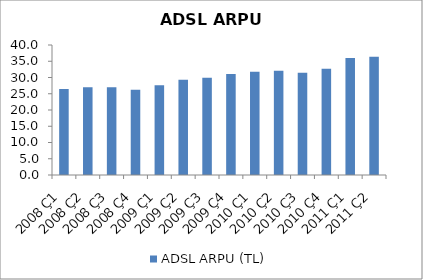
| Category | ADSL ARPU (TL) |
|---|---|
| 2008 Ç1 | 26.5 |
| 2008 Ç2 | 27 |
| 2008 Ç3 | 27 |
| 2008 Ç4 | 26.2 |
| 2009 Ç1 | 27.6 |
| 2009 Ç2 | 29.3 |
| 2009 Ç3 | 29.9 |
| 2009 Ç4 | 31.1 |
| 2010 Ç1 | 31.8 |
| 2010 Ç2 | 32.1 |
| 2010 Ç3 | 31.5 |
| 2010 Ç4 | 32.7 |
| 2011 Ç1 | 36 |
| 2011 Ç2 | 36.4 |